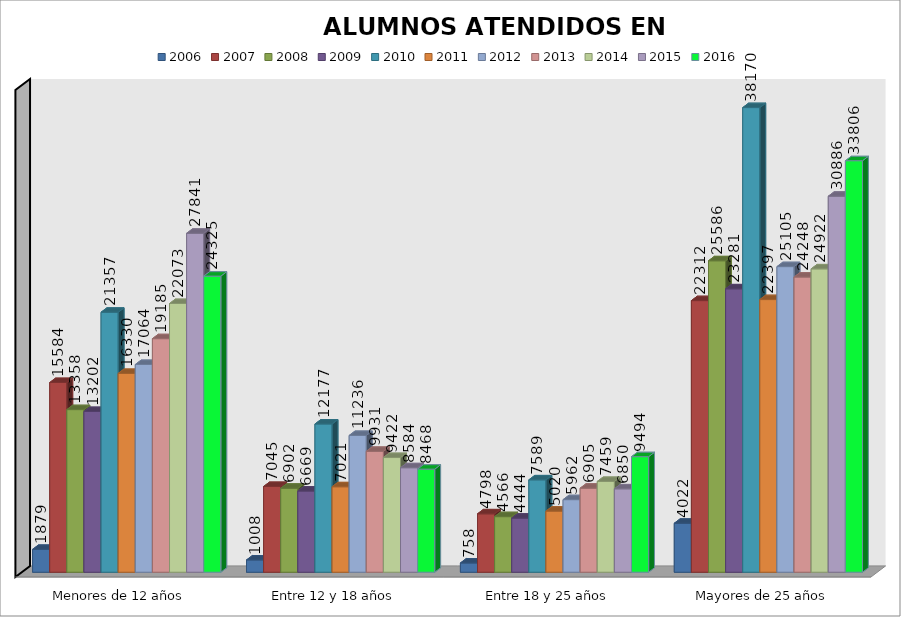
| Category | 2006 | 2007 | 2008 | 2009 | 2010 | 2011 | 2012 | 2013 | 2014 | 2015 | 2016 |
|---|---|---|---|---|---|---|---|---|---|---|---|
| Menores de 12 años | 1879 | 15584 | 13358 | 13202 | 21357 | 16330 | 17064 | 19185 | 22073 | 27841 | 24325 |
| Entre 12 y 18 años | 1008 | 7045 | 6902 | 6669 | 12177 | 7021 | 11236 | 9931 | 9422 | 8584 | 8468 |
| Entre 18 y 25 años | 758 | 4798 | 4566 | 4444 | 7589 | 5020 | 5962 | 6905 | 7459 | 6850 | 9494 |
| Mayores de 25 años | 4022 | 22312 | 25586 | 23281 | 38170 | 22397 | 25105 | 24248 | 24922 | 30886 | 33806 |